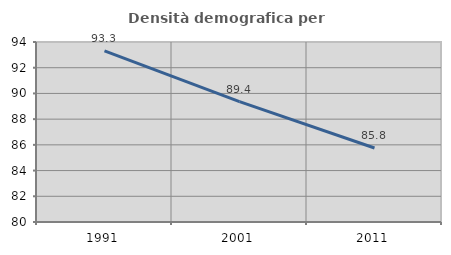
| Category | Densità demografica |
|---|---|
| 1991.0 | 93.315 |
| 2001.0 | 89.359 |
| 2011.0 | 85.756 |